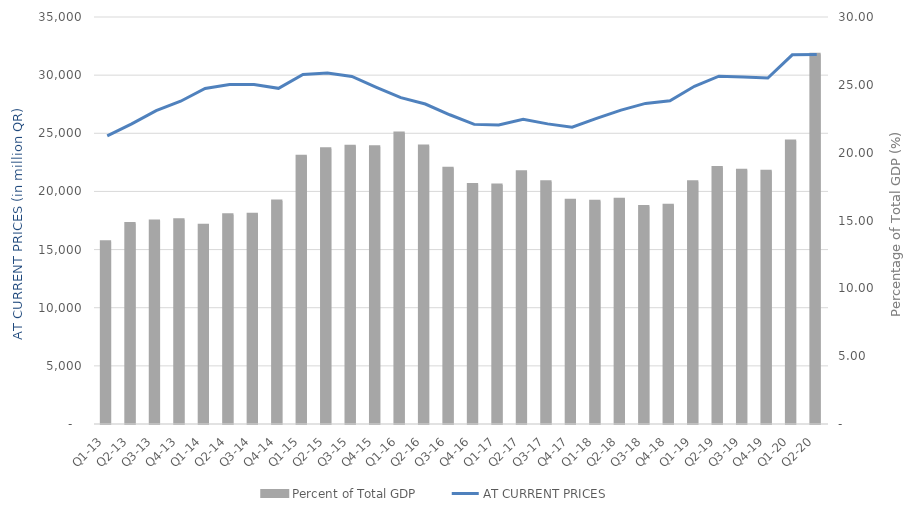
| Category | Percent of Total GDP |
|---|---|
| Q1-13 | 13.436 |
| Q2-13 | 14.783 |
| Q3-13 | 14.97 |
| Q4-13 | 15.057 |
| Q1-14 | 14.657 |
| Q2-14 | 15.418 |
| Q3-14 | 15.458 |
| Q4-14 | 16.438 |
| Q1-15 | 19.732 |
| Q2-15 | 20.281 |
| Q3-15 | 20.478 |
| Q4-15 | 20.445 |
| Q1-16 | 21.442 |
| Q2-16 | 20.486 |
| Q3-16 | 18.851 |
| Q4-16 | 17.645 |
| Q1-17 | 17.618 |
| Q2-17 | 18.595 |
| Q3-17 | 17.85 |
| Q4-17 | 16.487 |
| Q1-18 | 16.415 |
| Q2-18 | 16.566 |
| Q3-18 | 16.037 |
| Q4-18 | 16.131 |
| Q1-19 | 17.85 |
| Q2-19 | 18.914 |
| Q3-19 | 18.696 |
| Q4-19 | 18.636 |
| Q1-20 | 20.863 |
| Q2-20 | 27.249 |